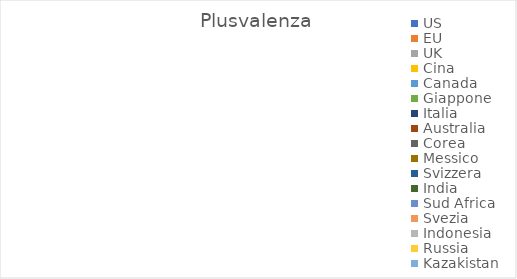
| Category | Plusvalenza |
|---|---|
| US | 0 |
| EU | 0 |
| UK | 0 |
| Cina | 0 |
| Canada | 0 |
| Giappone | 0 |
| Italia | 0 |
| Australia | 0 |
| Corea | 0 |
| Messico | 0 |
| Svizzera | 0 |
| India | 0 |
| Sud Africa | 0 |
| Svezia | 0 |
| Indonesia | 0 |
| Russia | 0 |
| Kazakistan | 0 |